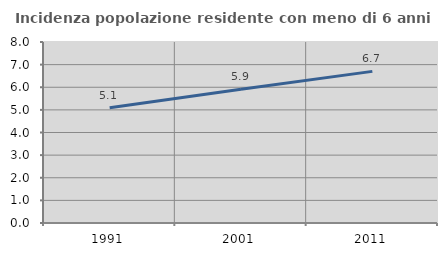
| Category | Incidenza popolazione residente con meno di 6 anni |
|---|---|
| 1991.0 | 5.095 |
| 2001.0 | 5.909 |
| 2011.0 | 6.702 |